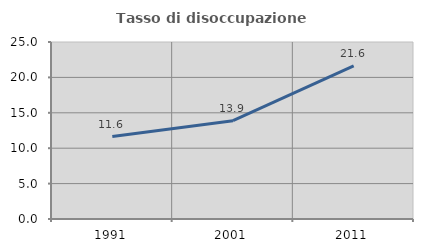
| Category | Tasso di disoccupazione giovanile  |
|---|---|
| 1991.0 | 11.644 |
| 2001.0 | 13.889 |
| 2011.0 | 21.622 |